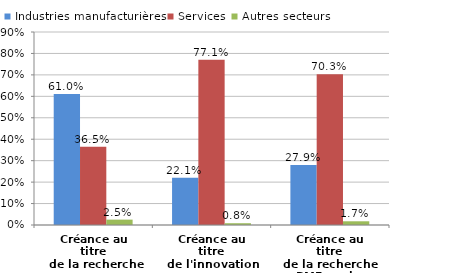
| Category | Industries manufacturières | Services | Autres secteurs |
|---|---|---|---|
| Créance au titre
 de la recherche | 0.61 | 0.364 | 0.025 |
| Créance au titre
de l'innovation | 0.221 | 0.771 | 0.008 |
| Créance au titre
de la recherche
PME seules | 0.279 | 0.703 | 0.017 |